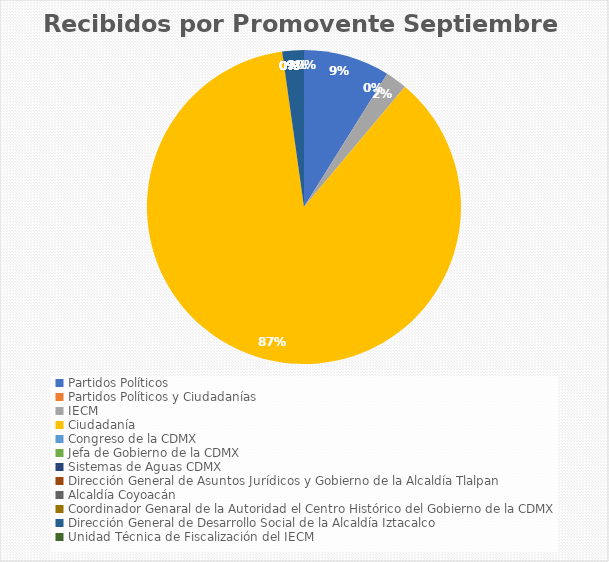
| Category | Recibidos por Promovente Septiembre |
|---|---|
| Partidos Políticos | 4 |
| Partidos Políticos y Ciudadanías | 0 |
| IECM | 1 |
| Ciudadanía  | 39 |
| Congreso de la CDMX | 0 |
| Jefa de Gobierno de la CDMX | 0 |
| Sistemas de Aguas CDMX | 0 |
| Dirección General de Asuntos Jurídicos y Gobierno de la Alcaldía Tlalpan | 0 |
| Alcaldía Coyoacán | 0 |
| Coordinador Genaral de la Autoridad el Centro Histórico del Gobierno de la CDMX | 0 |
| Dirección General de Desarrollo Social de la Alcaldía Iztacalco | 1 |
| Unidad Técnica de Fiscalización del IECM | 0 |